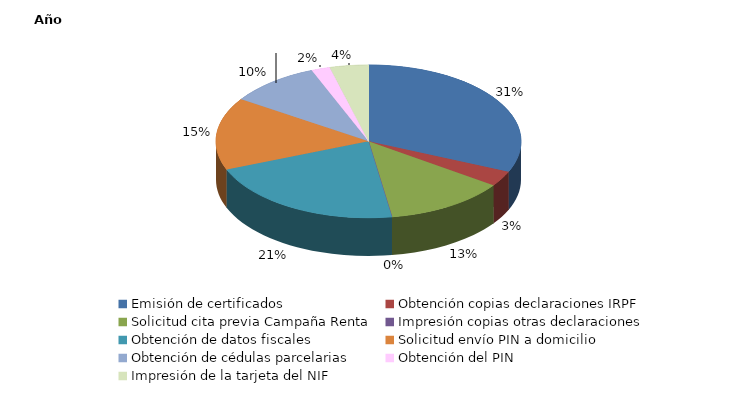
| Category | Series 0 |
|---|---|
| Emisión de certificados   | 816 |
| Obtención copias declaraciones IRPF | 84 |
| Solicitud cita previa Campaña Renta | 332 |
| Impresión copias otras declaraciones | 0 |
| Obtención de datos fiscales | 555 |
| Solicitud envío PIN a domicilio | 397 |
| Obtención de cédulas parcelarias | 250 |
| Obtención del PIN | 51 |
| Impresión de la tarjeta del NIF | 106 |